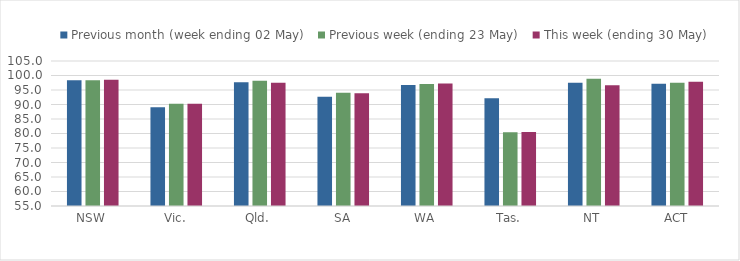
| Category | Previous month (week ending 02 May) | Previous week (ending 23 May) | This week (ending 30 May) |
|---|---|---|---|
| NSW | 98.339 | 98.392 | 98.538 |
| Vic. | 89.071 | 90.255 | 90.278 |
| Qld. | 97.71 | 98.195 | 97.494 |
| SA | 92.701 | 94.02 | 93.862 |
| WA | 96.748 | 97.078 | 97.276 |
| Tas. | 92.138 | 80.423 | 80.522 |
| NT | 97.472 | 98.909 | 96.67 |
| ACT | 97.115 | 97.531 | 97.886 |